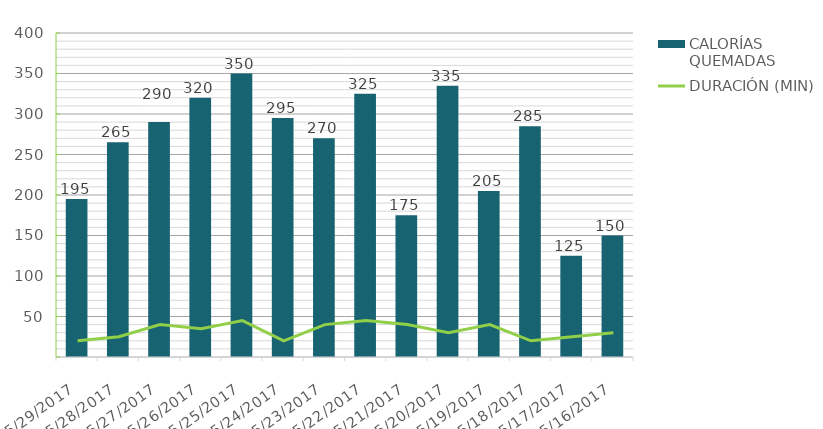
| Category | CALORÍAS QUEMADAS |
|---|---|
| 5/29/17 | 195 |
| 5/28/17 | 265 |
| 5/27/17 | 290 |
| 5/26/17 | 320 |
| 5/25/17 | 350 |
| 5/24/17 | 295 |
| 5/23/17 | 270 |
| 5/22/17 | 325 |
| 5/21/17 | 175 |
| 5/20/17 | 335 |
| 5/19/17 | 205 |
| 5/18/17 | 285 |
| 5/17/17 | 125 |
| 5/16/17 | 150 |